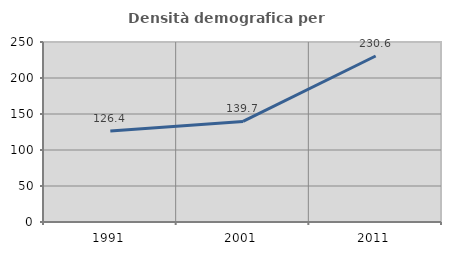
| Category | Densità demografica |
|---|---|
| 1991.0 | 126.422 |
| 2001.0 | 139.702 |
| 2011.0 | 230.576 |